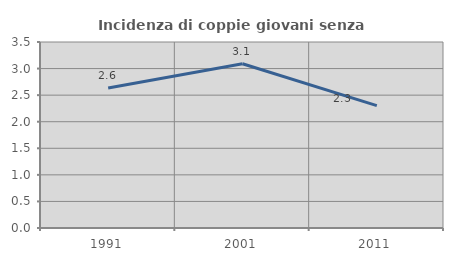
| Category | Incidenza di coppie giovani senza figli |
|---|---|
| 1991.0 | 2.634 |
| 2001.0 | 3.091 |
| 2011.0 | 2.302 |